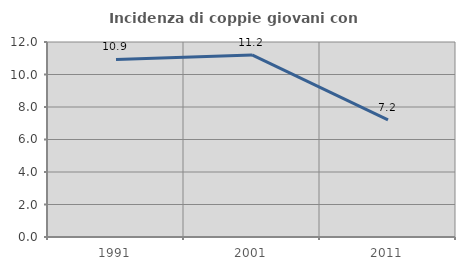
| Category | Incidenza di coppie giovani con figli |
|---|---|
| 1991.0 | 10.926 |
| 2001.0 | 11.204 |
| 2011.0 | 7.202 |